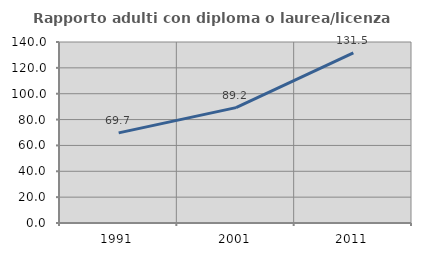
| Category | Rapporto adulti con diploma o laurea/licenza media  |
|---|---|
| 1991.0 | 69.693 |
| 2001.0 | 89.24 |
| 2011.0 | 131.522 |